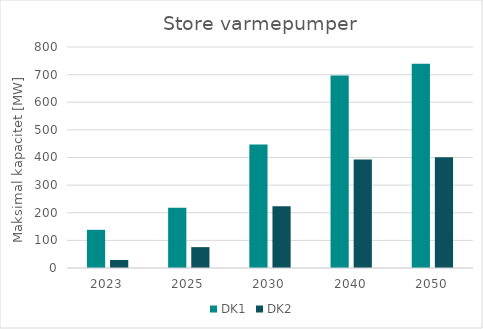
| Category | DK1 | DK2 |
|---|---|---|
| 2023.0 | 138.28 | 28.96 |
| 2025.0 | 217.72 | 75.53 |
| 2030.0 | 447.5 | 223.16 |
| 2040.0 | 696.53 | 393.09 |
| 2050.0 | 739.57 | 401.15 |